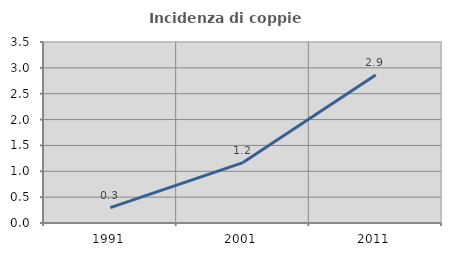
| Category | Incidenza di coppie miste |
|---|---|
| 1991.0 | 0.297 |
| 2001.0 | 1.168 |
| 2011.0 | 2.864 |